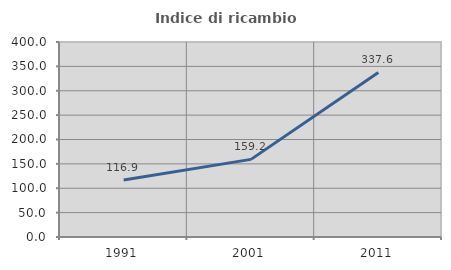
| Category | Indice di ricambio occupazionale  |
|---|---|
| 1991.0 | 116.877 |
| 2001.0 | 159.233 |
| 2011.0 | 337.64 |